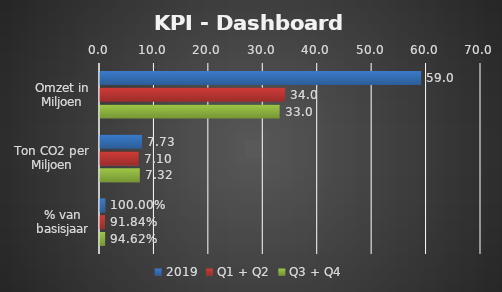
| Category | 2019 | Q1 + Q2 | Q3 + Q4 |
|---|---|---|---|
| Omzet in Miljoen | 59 | 34 | 33 |
| Ton CO2 per Miljoen | 7.732 | 7.101 | 7.316 |
| % van basisjaar | 1 | 0.918 | 0.946 |